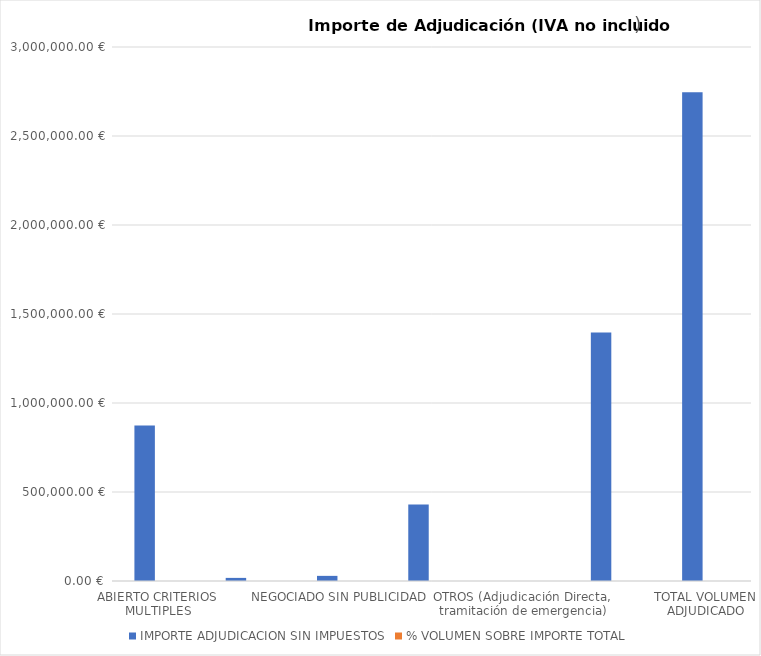
| Category | IMPORTE ADJUDICACION SIN IMPUESTOS | % VOLUMEN SOBRE IMPORTE TOTAL |
|---|---|---|
| ABIERTO CRITERIOS MULTIPLES | 873307.98 | 0.318 |
| ABIERTO SIMPLIFICADO SUMARIO | 17459.77 | 0.006 |
| NEGOCIADO SIN PUBLICIDAD | 28824 | 0.01 |
| Contratos Basados en Acuerdo Marco | 429662.01 | 0.156 |
| OTROS (Adjudicación Directa, tramitación de emergencia) | 0 | 0 |
| CONTRATOS MENORES * | 1396162.65 | 0.508 |
| TOTAL VOLUMEN ADJUDICADO | 2745416.41 | 1 |